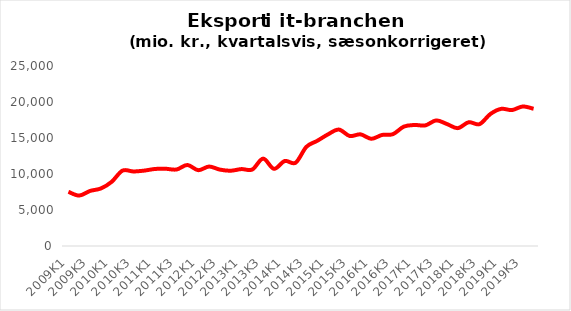
| Category | Samlet eksport i It-branchen |
|---|---|
| 2009K1 | 7527.83 |
| 2009K2 | 7004.297 |
| 2009K3 | 7646.046 |
| 2009K4 | 7989.97 |
| 2010K1 | 8915.627 |
| 2010K2 | 10470.512 |
| 2010K3 | 10354.184 |
| 2010K4 | 10469.466 |
| 2011K1 | 10698.215 |
| 2011K2 | 10726.001 |
| 2011K3 | 10624.907 |
| 2011K4 | 11252.823 |
| 2012K1 | 10530.836 |
| 2012K2 | 11034.813 |
| 2012K3 | 10610.281 |
| 2012K4 | 10453.526 |
| 2013K1 | 10683.792 |
| 2013K2 | 10626.3 |
| 2013K3 | 12137.079 |
| 2013K4 | 10715.698 |
| 2014K1 | 11805.079 |
| 2014K2 | 11566.325 |
| 2014K3 | 13775.874 |
| 2014K4 | 14605.564 |
| 2015K1 | 15508.686 |
| 2015K2 | 16172.322 |
| 2015K3 | 15279.962 |
| 2015K4 | 15506.701 |
| 2016K1 | 14891.623 |
| 2016K2 | 15424.987 |
| 2016K3 | 15532.534 |
| 2016K4 | 16578.632 |
| 2017K1 | 16806.537 |
| 2017K2 | 16753.096 |
| 2017K3 | 17443.934 |
| 2017K4 | 16932.506 |
| 2018K1 | 16371.014 |
| 2018K2 | 17190.038 |
| 2018K3 | 16922.39 |
| 2018K4 | 18326.152 |
| 2019K1 | 19046.827 |
| 2019K2 | 18879.618 |
| 2019K3 | 19376.361 |
| 2019K4 | 19058.361 |